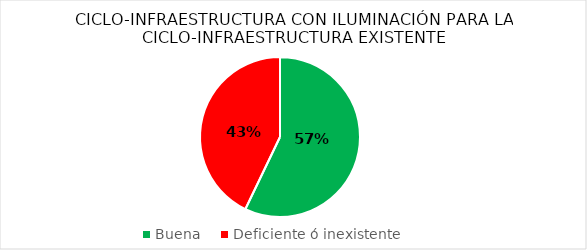
| Category | Series 0 |
|---|---|
| Buena  | 57.124 |
| Deficiente ó inexistente | 42.876 |